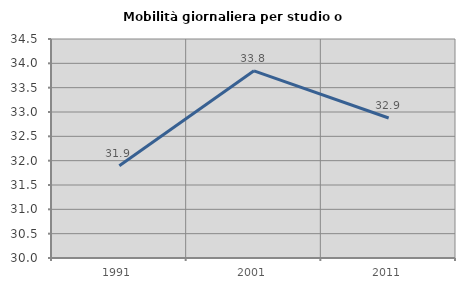
| Category | Mobilità giornaliera per studio o lavoro |
|---|---|
| 1991.0 | 31.897 |
| 2001.0 | 33.846 |
| 2011.0 | 32.877 |